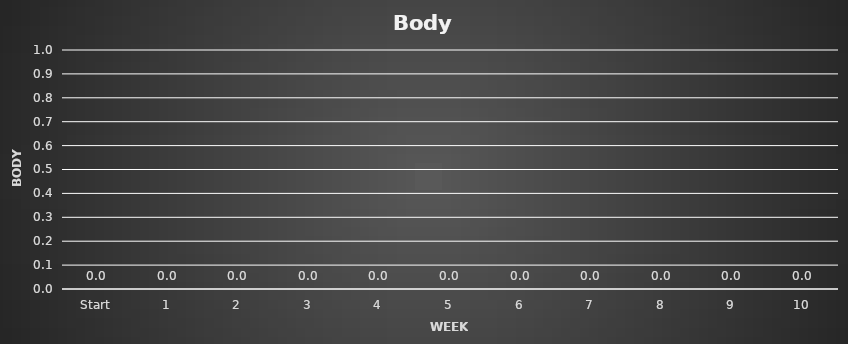
| Category | Body Weight |
|---|---|
| Start | 0 |
| 1 | 0 |
| 2 | 0 |
| 3 | 0 |
| 4 | 0 |
| 5 | 0 |
| 6 | 0 |
| 7 | 0 |
| 8 | 0 |
| 9 | 0 |
| 10 | 0 |